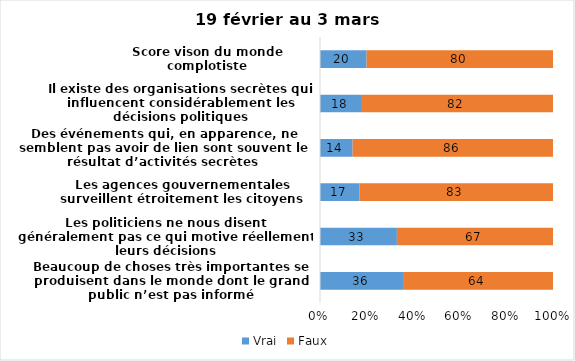
| Category | Vrai | Faux |
|---|---|---|
| Beaucoup de choses très importantes se produisent dans le monde dont le grand public n’est pas informé | 36 | 64 |
| Les politiciens ne nous disent généralement pas ce qui motive réellement leurs décisions | 33 | 67 |
| Les agences gouvernementales surveillent étroitement les citoyens | 17 | 83 |
| Des événements qui, en apparence, ne semblent pas avoir de lien sont souvent le résultat d’activités secrètes | 14 | 86 |
| Il existe des organisations secrètes qui influencent considérablement les décisions politiques | 18 | 82 |
| Score vison du monde complotiste | 20 | 80 |